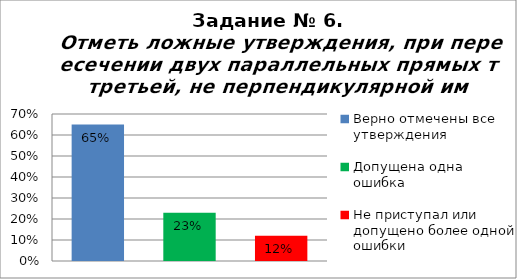
| Category | Отметь ложные утверждения, при пересечении двух параллельных прямых третьей, не перпендикулярной им. |
|---|---|
| Верно отмечены все утверждения | 0.65 |
| Допущена одна ошибка | 0.23 |
| Не приступал или допущено более одной ошибки | 0.12 |